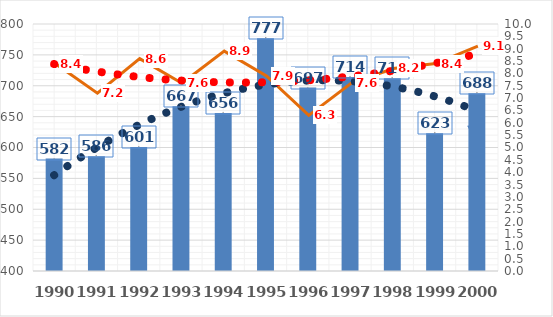
| Category | srážky [mm] |
|---|---|
| 1990.0 | 582 |
| 1991.0 | 586 |
| 1992.0 | 601 |
| 1993.0 | 667 |
| 1994.0 | 656 |
| 1995.0 | 777 |
| 1996.0 | 697 |
| 1997.0 | 714 |
| 1998.0 | 712 |
| 1999.0 | 623 |
| 2000.0 | 688 |